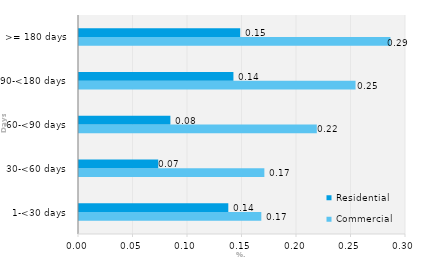
| Category | Commercial | Residential |
|---|---|---|
| 1-<30 days | 0.167 | 0.137 |
| 30-<60 days | 0.17 | 0.073 |
| 60-<90 days | 0.218 | 0.084 |
| 90-<180 days | 0.254 | 0.142 |
| >= 180 days | 0.286 | 0.148 |